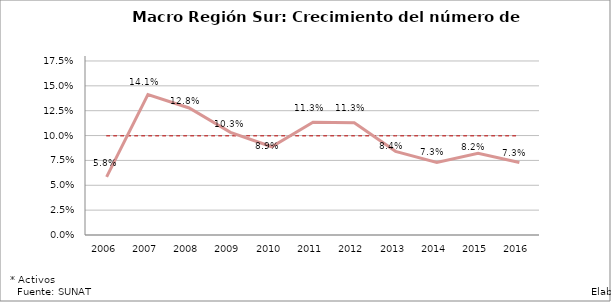
| Category | Var. % prom | Var. % |
|---|---|---|
| 2006.0 | 0.1 | 0.058 |
| 2007.0 | 0.1 | 0.141 |
| 2008.0 | 0.1 | 0.128 |
| 2009.0 | 0.1 | 0.103 |
| 2010.0 | 0.1 | 0.089 |
| 2011.0 | 0.1 | 0.113 |
| 2012.0 | 0.1 | 0.113 |
| 2013.0 | 0.1 | 0.084 |
| 2014.0 | 0.1 | 0.073 |
| 2015.0 | 0.1 | 0.082 |
| 2016.0 | 0.1 | 0.073 |